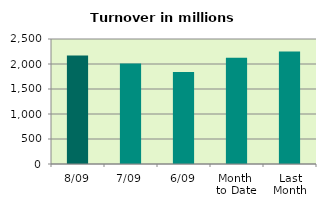
| Category | Series 0 |
|---|---|
| 8/09 | 2172.419 |
| 7/09 | 2011.936 |
| 6/09 | 1838.004 |
| Month 
to Date | 2124.603 |
| Last
Month | 2249.305 |